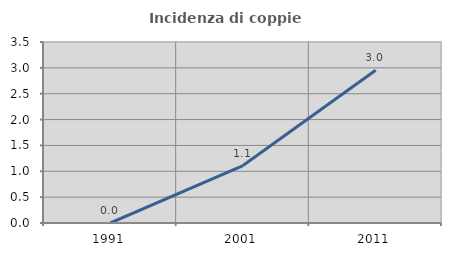
| Category | Incidenza di coppie miste |
|---|---|
| 1991.0 | 0 |
| 2001.0 | 1.111 |
| 2011.0 | 2.952 |